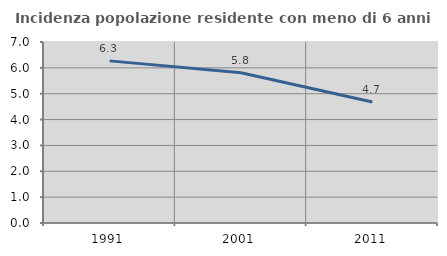
| Category | Incidenza popolazione residente con meno di 6 anni |
|---|---|
| 1991.0 | 6.27 |
| 2001.0 | 5.814 |
| 2011.0 | 4.679 |